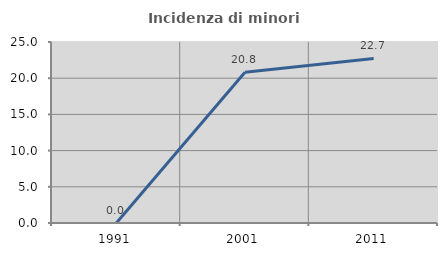
| Category | Incidenza di minori stranieri |
|---|---|
| 1991.0 | 0 |
| 2001.0 | 20.833 |
| 2011.0 | 22.727 |